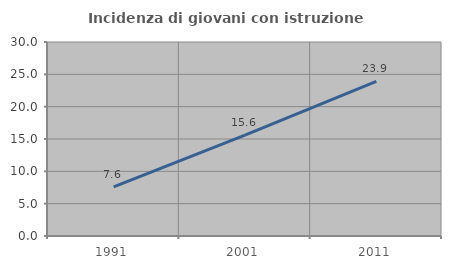
| Category | Incidenza di giovani con istruzione universitaria |
|---|---|
| 1991.0 | 7.598 |
| 2001.0 | 15.61 |
| 2011.0 | 23.907 |